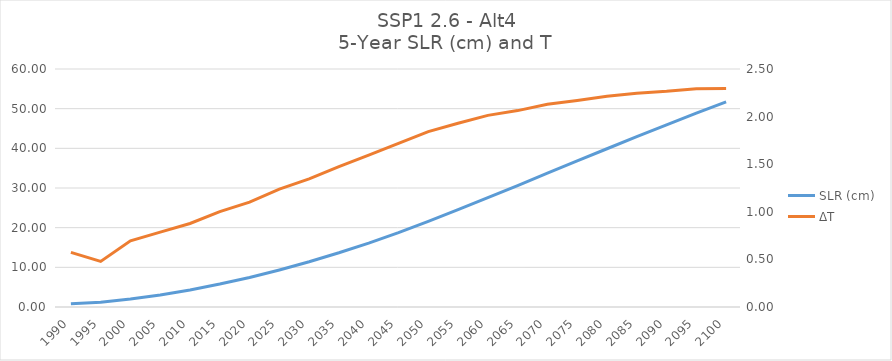
| Category | SLR (cm) |
|---|---|
| 1990.0 | 0.83 |
| 1995.0 | 1.225 |
| 2000.0 | 2.004 |
| 2005.0 | 3.047 |
| 2010.0 | 4.302 |
| 2015.0 | 5.786 |
| 2020.0 | 7.449 |
| 2025.0 | 9.339 |
| 2030.0 | 11.401 |
| 2035.0 | 13.667 |
| 2040.0 | 16.121 |
| 2045.0 | 18.762 |
| 2050.0 | 21.594 |
| 2055.0 | 24.533 |
| 2060.0 | 27.568 |
| 2065.0 | 30.62 |
| 2070.0 | 33.724 |
| 2075.0 | 36.812 |
| 2080.0 | 39.895 |
| 2085.0 | 42.944 |
| 2090.0 | 45.927 |
| 2095.0 | 48.864 |
| 2100.0 | 51.701 |